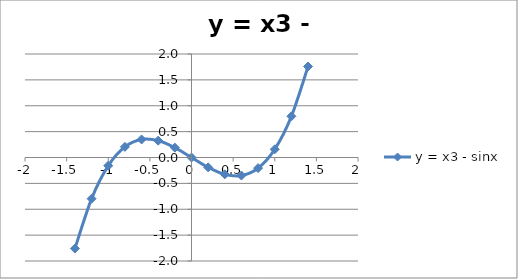
| Category | y = x3 - sinx |
|---|---|
| -1.4 | -1.759 |
| -1.2 | -0.796 |
| -1.0 | -0.159 |
| -0.8 | 0.205 |
| -0.6 | 0.349 |
| -0.4 | 0.325 |
| -0.2 | 0.191 |
| 0.0 | 0 |
| 0.2 | -0.191 |
| 0.4 | -0.325 |
| 0.6 | -0.349 |
| 0.8 | -0.205 |
| 1.0 | 0.159 |
| 1.2 | 0.796 |
| 1.4 | 1.759 |